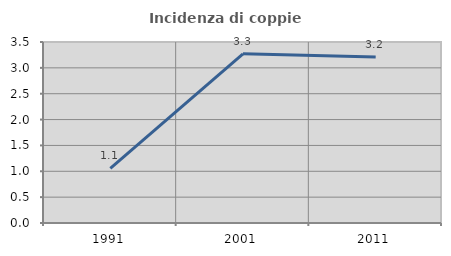
| Category | Incidenza di coppie miste |
|---|---|
| 1991.0 | 1.058 |
| 2001.0 | 3.271 |
| 2011.0 | 3.211 |